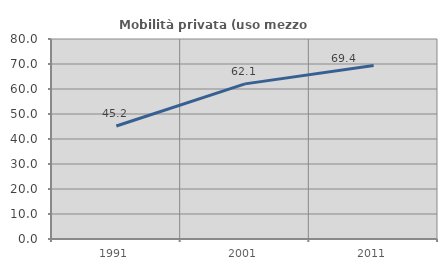
| Category | Mobilità privata (uso mezzo privato) |
|---|---|
| 1991.0 | 45.2 |
| 2001.0 | 62.054 |
| 2011.0 | 69.43 |